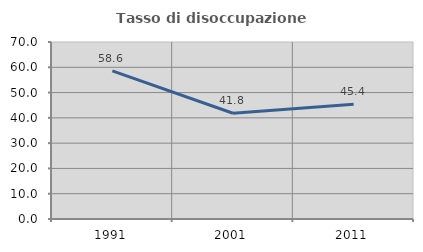
| Category | Tasso di disoccupazione giovanile  |
|---|---|
| 1991.0 | 58.565 |
| 2001.0 | 41.808 |
| 2011.0 | 45.402 |